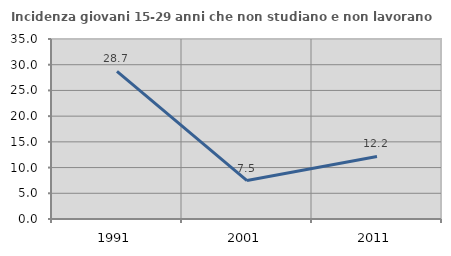
| Category | Incidenza giovani 15-29 anni che non studiano e non lavorano  |
|---|---|
| 1991.0 | 28.685 |
| 2001.0 | 7.474 |
| 2011.0 | 12.171 |